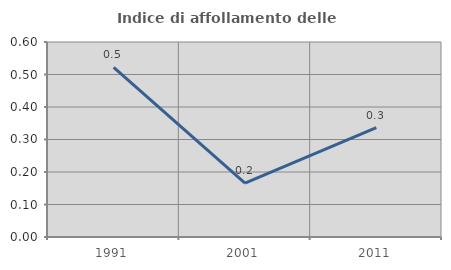
| Category | Indice di affollamento delle abitazioni  |
|---|---|
| 1991.0 | 0.522 |
| 2001.0 | 0.166 |
| 2011.0 | 0.336 |